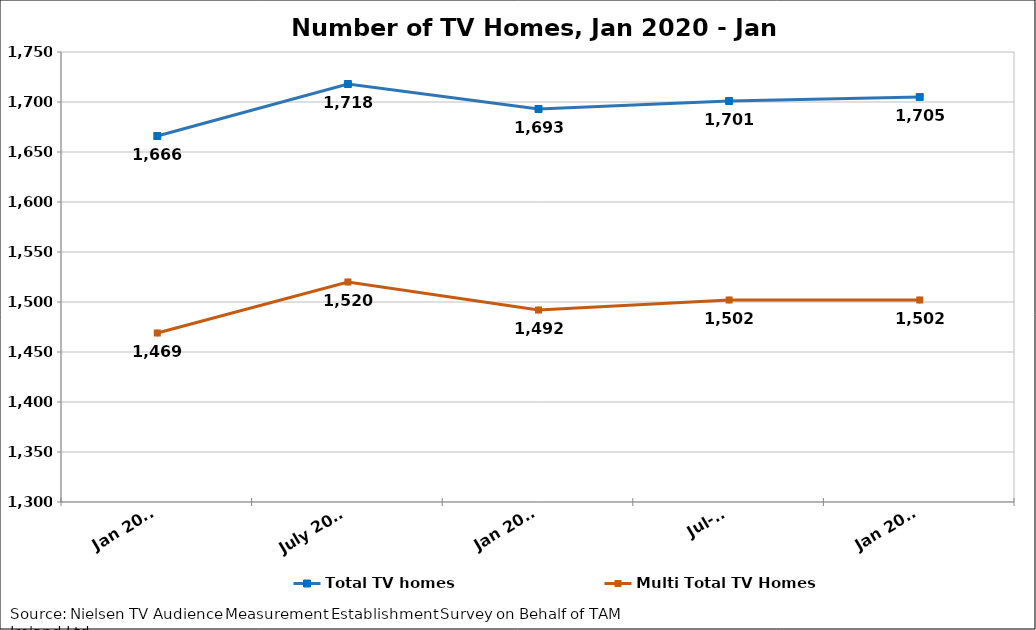
| Category | Total TV homes | Multi Total TV Homes |
|---|---|---|
| Jan 2020 | 1666 | 1469 |
| July 2020 | 1718 | 1520 |
| Jan 2021 | 1693 | 1492 |
| Jul-21 | 1701 | 1502 |
| Jan 2022 | 1705 | 1502 |